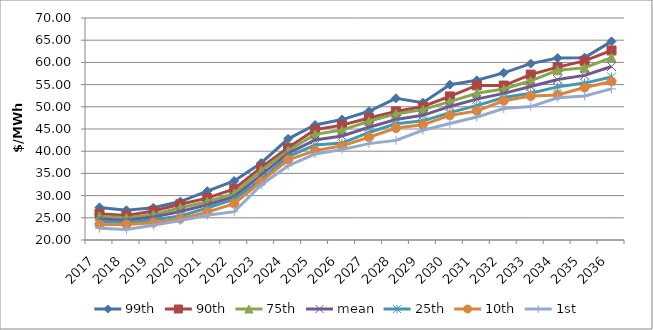
| Category | 99th | 90th | 75th | mean | 25th | 10th | 1st |
|---|---|---|---|---|---|---|---|
| 2017.0 | 27.341 | 25.931 | 25.362 | 24.756 | 24.124 | 23.461 | 22.647 |
| 2018.0 | 26.696 | 25.52 | 25.02 | 24.471 | 23.962 | 23.511 | 22.382 |
| 2019.0 | 27.26 | 26.549 | 25.698 | 25.182 | 24.552 | 23.898 | 23.331 |
| 2020.0 | 28.657 | 28.07 | 27.271 | 26.407 | 25.383 | 24.793 | 24.407 |
| 2021.0 | 31 | 29.436 | 28.63 | 27.938 | 27.212 | 26.285 | 25.561 |
| 2022.0 | 33.286 | 31.526 | 30.481 | 29.778 | 29.215 | 28.19 | 26.376 |
| 2023.0 | 37.345 | 36.342 | 35.695 | 34.666 | 33.607 | 33.132 | 32.407 |
| 2024.0 | 42.781 | 40.769 | 40.119 | 39.498 | 38.796 | 38.063 | 36.724 |
| 2025.0 | 45.893 | 44.843 | 43.788 | 42.535 | 41.385 | 40.138 | 39.363 |
| 2026.0 | 47.123 | 45.871 | 44.757 | 43.423 | 41.826 | 41.208 | 40.4 |
| 2027.0 | 48.999 | 47.477 | 46.739 | 45.385 | 44.22 | 43.147 | 41.71 |
| 2028.0 | 51.917 | 48.962 | 48.396 | 47.147 | 46.168 | 45.204 | 42.437 |
| 2029.0 | 50.94 | 50.074 | 49.365 | 48.076 | 46.841 | 45.959 | 44.713 |
| 2030.0 | 54.973 | 52.335 | 51.166 | 50.079 | 48.7 | 48.059 | 46.245 |
| 2031.0 | 55.968 | 54.823 | 53.044 | 51.725 | 50.276 | 49.076 | 47.685 |
| 2032.0 | 57.643 | 54.787 | 54.008 | 53.023 | 52.085 | 51.362 | 49.605 |
| 2033.0 | 59.721 | 57.259 | 55.861 | 54.581 | 53.064 | 52.428 | 50.045 |
| 2034.0 | 60.975 | 58.933 | 58.234 | 56.142 | 54.486 | 52.679 | 52.043 |
| 2035.0 | 61.074 | 60.349 | 58.805 | 57.08 | 55.337 | 54.333 | 52.449 |
| 2036.0 | 64.734 | 62.687 | 61.086 | 59.076 | 56.714 | 55.71 | 54.045 |